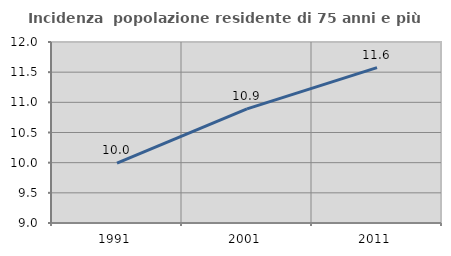
| Category | Incidenza  popolazione residente di 75 anni e più |
|---|---|
| 1991.0 | 9.992 |
| 2001.0 | 10.892 |
| 2011.0 | 11.576 |